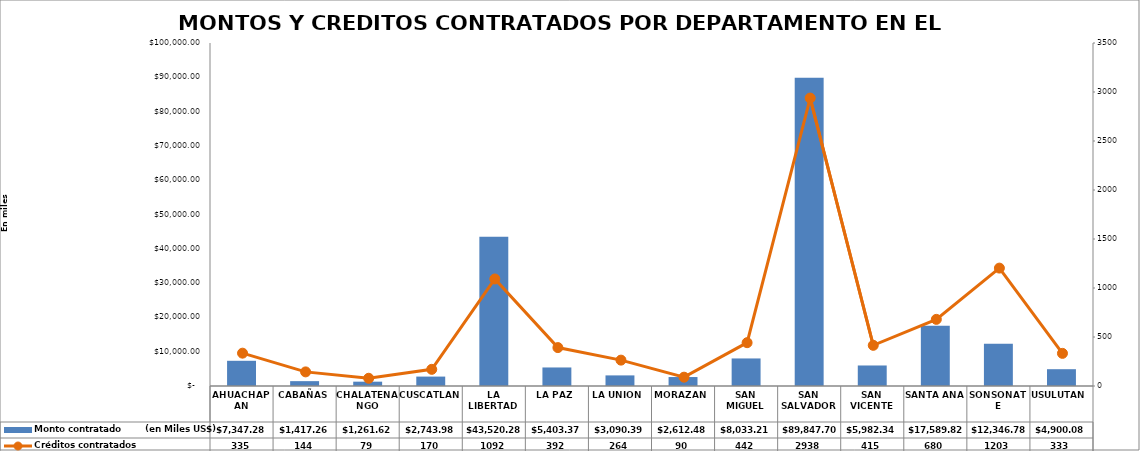
| Category | Monto contratado        (en Miles US$) |
|---|---|
| AHUACHAPAN | 7347.28 |
| CABAÑAS | 1417.262 |
| CHALATENANGO | 1261.615 |
| CUSCATLAN | 2743.981 |
| LA LIBERTAD | 43520.283 |
| LA PAZ | 5403.366 |
| LA UNION | 3090.388 |
| MORAZAN | 2612.48 |
| SAN MIGUEL | 8033.208 |
| SAN SALVADOR | 89847.699 |
| SAN VICENTE | 5982.343 |
| SANTA ANA | 17589.818 |
| SONSONATE | 12346.776 |
| USULUTAN | 4900.084 |